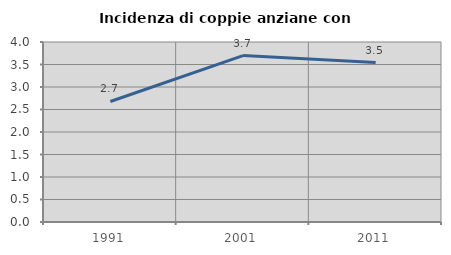
| Category | Incidenza di coppie anziane con figli |
|---|---|
| 1991.0 | 2.679 |
| 2001.0 | 3.698 |
| 2011.0 | 3.544 |